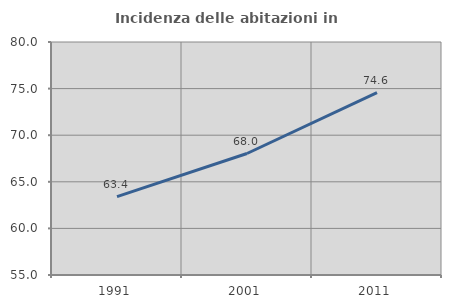
| Category | Incidenza delle abitazioni in proprietà  |
|---|---|
| 1991.0 | 63.416 |
| 2001.0 | 68.036 |
| 2011.0 | 74.57 |